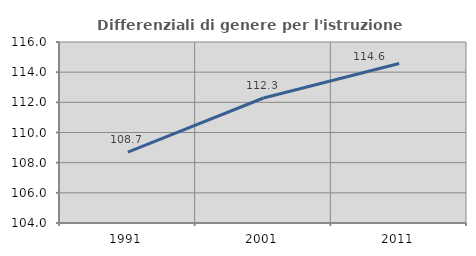
| Category | Differenziali di genere per l'istruzione superiore |
|---|---|
| 1991.0 | 108.699 |
| 2001.0 | 112.286 |
| 2011.0 | 114.57 |